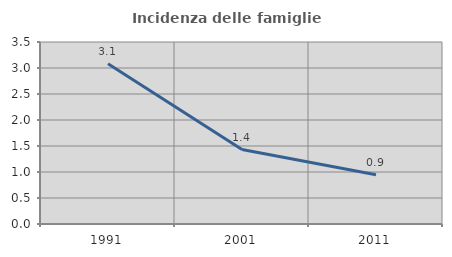
| Category | Incidenza delle famiglie numerose |
|---|---|
| 1991.0 | 3.082 |
| 2001.0 | 1.433 |
| 2011.0 | 0.946 |